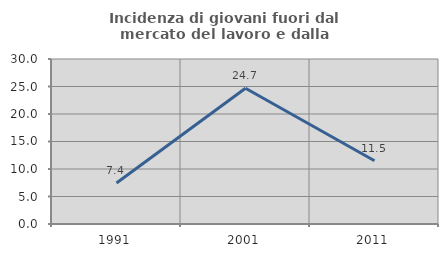
| Category | Incidenza di giovani fuori dal mercato del lavoro e dalla formazione  |
|---|---|
| 1991.0 | 7.443 |
| 2001.0 | 24.679 |
| 2011.0 | 11.489 |